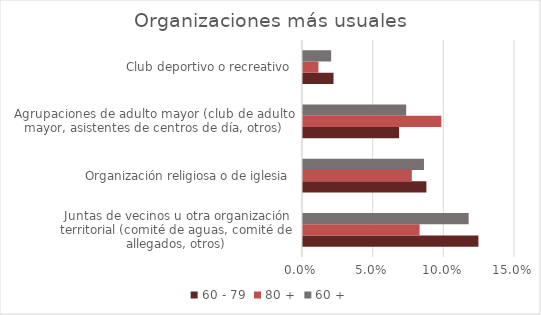
| Category | 60 - 79 | 80 + | 60 + |
|---|---|---|---|
| Juntas de vecinos u otra organización territorial (comité de aguas, comité de allegados, otros) | 0.124 | 0.082 | 0.117 |
| Organización religiosa o de iglesia | 0.087 | 0.077 | 0.086 |
| Agrupaciones de adulto mayor (club de adulto mayor, asistentes de centros de día, otros) | 0.068 | 0.098 | 0.073 |
| Club deportivo o recreativo | 0.022 | 0.011 | 0.02 |